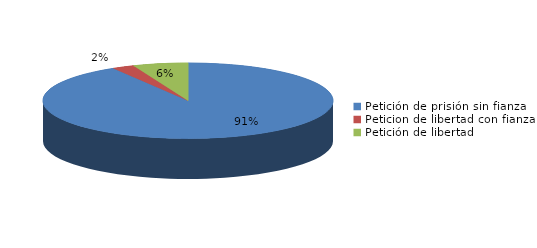
| Category | Series 0 |
|---|---|
| Petición de prisión sin fianza | 223 |
| Peticion de libertad con fianza | 6 |
| Petición de libertad | 15 |